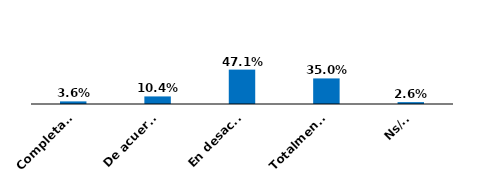
| Category | Series 0 |
|---|---|
| Completamente de acuerdo | 0.036 |
| De acuerdo | 0.104 |
| En desacuerdo | 0.471 |
| Totalmente en desacuerdo | 0.35 |
| Ns/Nr | 0.026 |